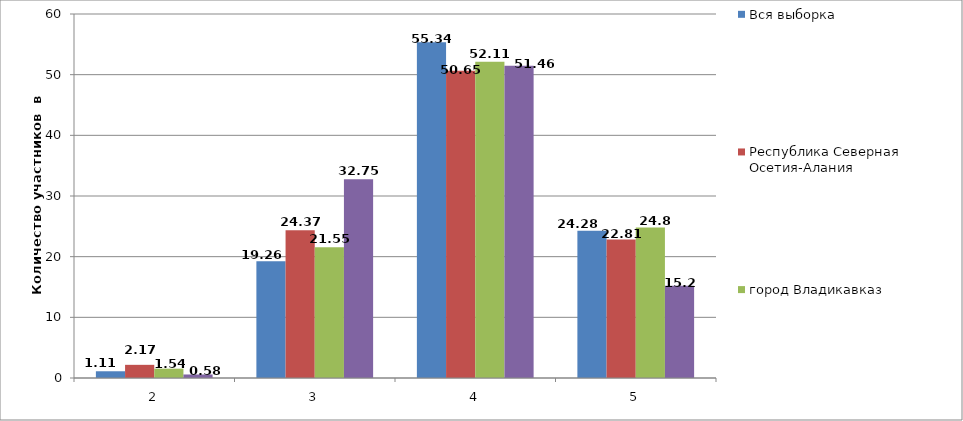
| Category | Вся выборка | Республика Северная Осетия-Алания | город Владикавказ | Муниципальное бюджетное общеобразовательное учреждение средняя общеобразовательная школа №42 имени Героя Советского Союза Хаджи-Умара Джиоровича Мамсурова |
|---|---|---|---|---|
| 0 | 1.11 | 2.17 | 1.54 | 0.58 |
| 1 | 19.26 | 24.37 | 21.55 | 32.75 |
| 2 | 55.34 | 50.65 | 52.11 | 51.46 |
| 3 | 24.28 | 22.81 | 24.8 | 15.2 |